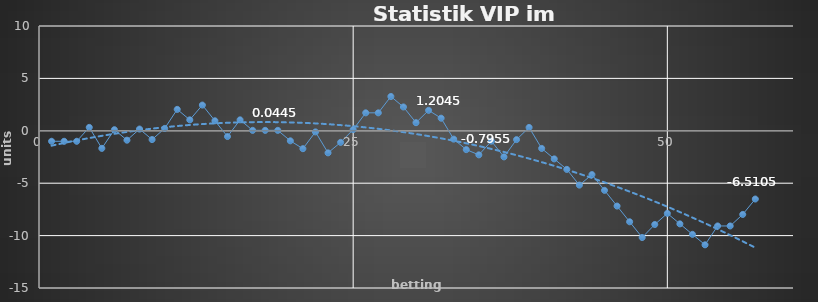
| Category | Series 0 |
|---|---|
| 0 | -1 |
| 1 | -1 |
| 2 | -1 |
| 3 | 0.326 |
| 4 | -1.674 |
| 5 | 0.106 |
| 6 | -0.894 |
| 7 | 0.166 |
| 8 | -0.834 |
| 9 | 0.226 |
| 10 | 2.044 |
| 11 | 1.044 |
| 12 | 2.454 |
| 13 | 0.954 |
| 14 | -0.546 |
| 15 | 1.044 |
| 16 | 0.044 |
| 17 | 0.044 |
| 18 | 0.044 |
| 19 | -0.956 |
| 20 | -1.706 |
| 21 | -0.106 |
| 22 | -2.106 |
| 23 | -1.106 |
| 24 | 0.115 |
| 25 | 1.715 |
| 26 | 1.715 |
| 27 | 3.274 |
| 28 | 2.274 |
| 29 | 0.775 |
| 30 | 1.955 |
| 31 | 1.205 |
| 32 | -0.795 |
| 33 | -1.795 |
| 34 | -2.295 |
| 35 | -0.99 |
| 36 | -2.49 |
| 37 | -0.84 |
| 38 | 0.32 |
| 39 | -1.68 |
| 40 | -2.68 |
| 41 | -3.68 |
| 42 | -5.18 |
| 43 | -4.18 |
| 44 | -5.68 |
| 45 | -7.18 |
| 46 | -8.68 |
| 47 | -10.18 |
| 48 | -8.94 |
| 49 | -7.88 |
| 50 | -8.88 |
| 51 | -9.88 |
| 52 | -10.88 |
| 53 | -9.08 |
| 54 | -9.08 |
| 55 | -7.98 |
| 56 | -6.51 |